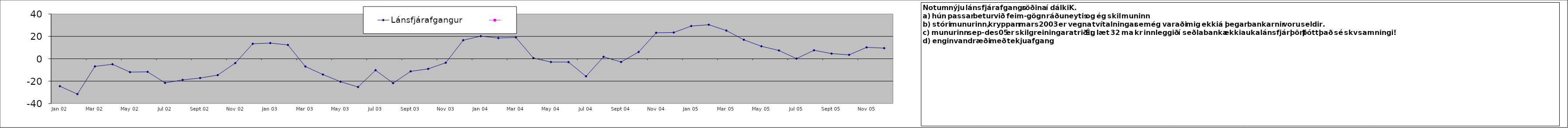
| Category | Lánsfjárafgangur | Series 1 |
|---|---|---|
| 2002-01-14 18:00:00 | -24.52 |  |
| 2002-02-14 04:30:00 | -31.58 |  |
| 2002-03-16 15:00:00 | -6.83 |  |
| 2002-04-16 01:30:00 | -4.93 |  |
| 2002-05-16 12:00:00 | -11.93 |  |
| 2002-06-15 22:30:00 | -11.68 |  |
| 2002-07-16 09:00:00 | -21.55 |  |
| 2002-08-15 19:30:00 | -18.9 |  |
| 2002-09-15 06:00:00 | -17.19 |  |
| 2002-10-15 16:30:00 | -14.6 |  |
| 2002-11-15 03:00:00 | -3.89 |  |
| 2002-12-15 13:30:00 | 13.39 |  |
| 2003-01-15 | 13.99 |  |
| 2003-02-14 10:30:00 | 12.36 |  |
| 2003-03-16 21:00:00 | -6.95 |  |
| 2003-04-16 19:30:00 | -14.1 |  |
| 2003-05-17 06:00:00 | -20.48 |  |
| 2003-06-16 16:30:00 | -25.21 |  |
| 2003-07-17 03:00:00 | -10.26 |  |
| 2003-08-17 | -21.78 |  |
| 2003-09-17 | -11.26 |  |
| 2003-10-17 | -9.03 |  |
| 2003-11-17 | -3.58 |  |
| 2003-12-17 | 16.57 |  |
| 2004-01-17 | 20.19 |  |
| 2004-02-17 | 18.53 |  |
| 2004-03-17 | 19.07 |  |
| 2004-04-17 | 0.59 |  |
| 2004-05-17 | -2.92 |  |
| 2004-06-17 | -2.97 |  |
| 2004-07-17 | -15.68 |  |
| 2004-08-17 | 1.74 |  |
| 2004-09-17 | -2.88 |  |
| 2004-10-17 | 6.06 |  |
| 2004-11-17 | 23.2 |  |
| 2004-12-17 | 23.45 |  |
| 2005-01-17 | 29.21 |  |
| 2005-02-17 | 30.4 |  |
| 2005-03-17 | 25.2 |  |
| 2005-04-17 | 16.93 |  |
| 2005-05-17 | 11.14 |  |
| 2005-06-17 | 7.41 |  |
| 2005-07-17 | 0.13 |  |
| 2005-08-17 | 7.58 |  |
| 2005-09-17 | 4.62 |  |
| 2005-10-17 | 3.49 |  |
| 2005-11-17 | 10.2 |  |
| 2005-12-17 | 9.48 |  |